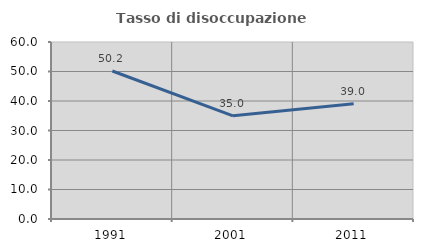
| Category | Tasso di disoccupazione giovanile  |
|---|---|
| 1991.0 | 50.178 |
| 2001.0 | 34.985 |
| 2011.0 | 39.044 |